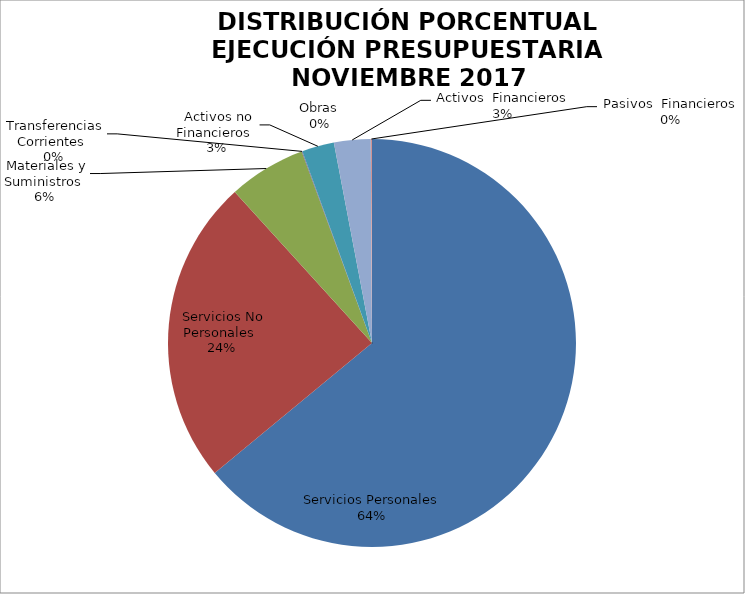
| Category | Series 0 | Series 1 |
|---|---|---|
| Servicios Personales | 12344579.49 | 0.68 |
| Servicios No Personales | 4676893.54 | 0.257 |
| Materiales y Suministros | 1183687.93 | 0.065 |
| Transferencias Corrientes | 10000 | 0 |
| Activos no Financieros | 492112.78 | 0.027 |
| Obras | 0 | 0 |
| Activos  Financieros | -559624.5 | -0.031 |
| Pasivos  Financieros | 18400 | 0.001 |